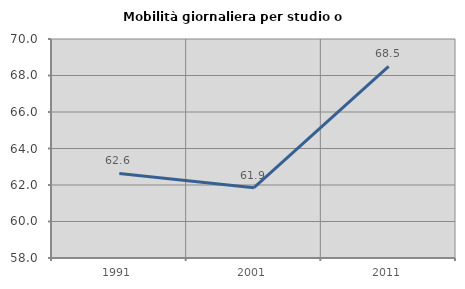
| Category | Mobilità giornaliera per studio o lavoro |
|---|---|
| 1991.0 | 62.633 |
| 2001.0 | 61.853 |
| 2011.0 | 68.494 |